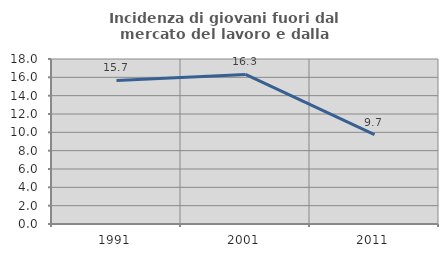
| Category | Incidenza di giovani fuori dal mercato del lavoro e dalla formazione  |
|---|---|
| 1991.0 | 15.659 |
| 2001.0 | 16.317 |
| 2011.0 | 9.749 |